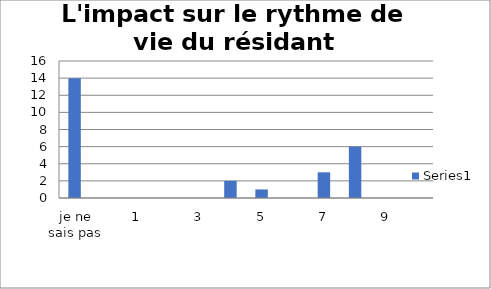
| Category | Series 0 |
|---|---|
| je ne sais pas | 14 |
| 0 | 0 |
| 1 | 0 |
| 2 | 0 |
| 3 | 0 |
| 4 | 2 |
| 5 | 1 |
| 6 | 0 |
| 7 | 3 |
| 8 | 6 |
| 9 | 0 |
| 10 | 0 |